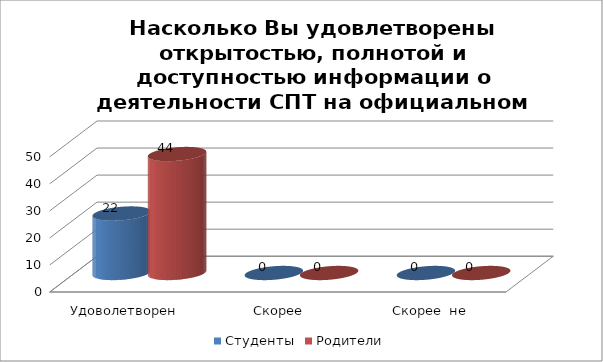
| Category | Студенты | Родители |
|---|---|---|
| Удоволетворен | 22 | 44 |
| Скорее удовлетворен | 0 | 0 |
| Скорее  не удовлетворен | 0 | 0 |